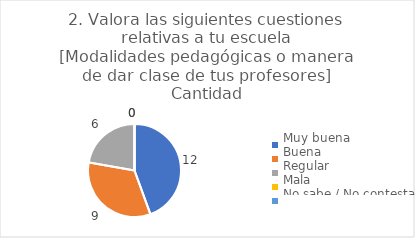
| Category | 2. Valora las siguientes cuestiones relativas a tu escuela
[Modalidades pedagógicas o manera de dar clase de tus profesores] |
|---|---|
| Muy buena  | 0.444 |
| Buena  | 0.333 |
| Regular  | 0.222 |
| Mala  | 0 |
| No sabe / No contesta | 0 |